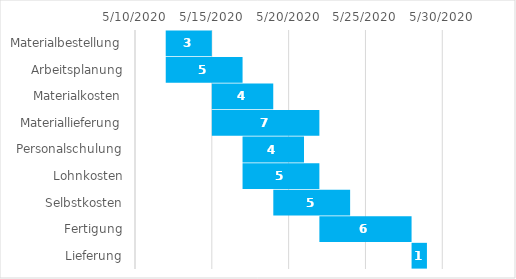
| Category | Starttermin | Dauer |
|---|---|---|
| Materialbestellung | 5/12/20 | 3 |
| Arbeitsplanung | 5/12/20 | 5 |
| Materialkosten | 5/15/20 | 4 |
| Materiallieferung | 5/15/20 | 7 |
| Personalschulung | 5/17/20 | 4 |
| Lohnkosten | 5/17/20 | 5 |
| Selbstkosten | 5/19/20 | 5 |
| Fertigung | 5/22/20 | 6 |
| Lieferung | 5/28/20 | 1 |